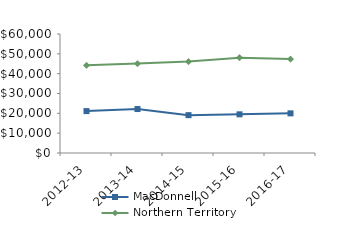
| Category | MacDonnell | Northern Territory |
|---|---|---|
| 2012-13 | 21123.21 | 44232.02 |
| 2013-14 | 22168.95 | 45075.51 |
| 2014-15 | 19084 | 46083.65 |
| 2015-16 | 19499.81 | 48046.27 |
| 2016-17 | 19986.41 | 47367.05 |